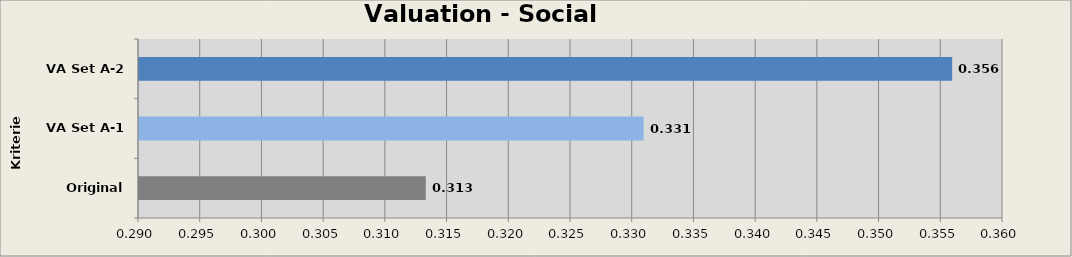
| Category | Valuation Social Module  |
|---|---|
| Original A-0 | 0.313 |
| VA Set A-1 | 0.331 |
| VA Set A-2 | 0.356 |